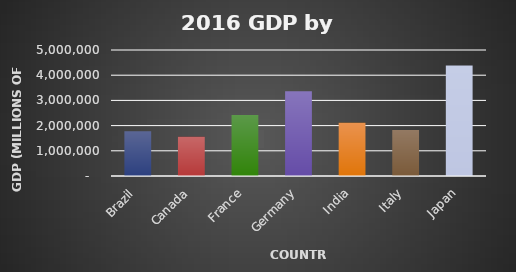
| Category | 2016 GDP |
|---|---|
|  Brazil | 1772591 |
|  Canada | 1552807 |
|  France | 2418945 |
|  Germany | 3363600 |
|  India | 2116239 |
|  Italy | 1821580 |
|  Japan | 4383076 |